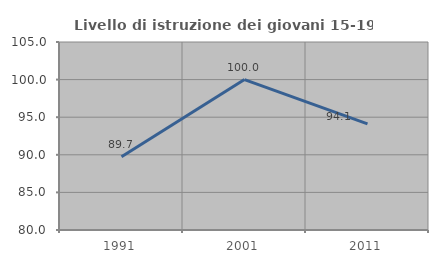
| Category | Livello di istruzione dei giovani 15-19 anni |
|---|---|
| 1991.0 | 89.744 |
| 2001.0 | 100 |
| 2011.0 | 94.118 |